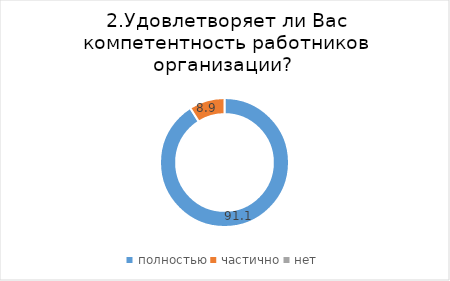
| Category | Series 0 |
|---|---|
| полностью | 91.078 |
| частично | 8.922 |
| нет | 0 |